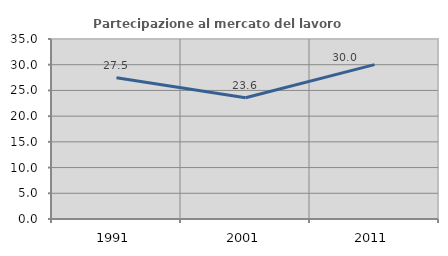
| Category | Partecipazione al mercato del lavoro  femminile |
|---|---|
| 1991.0 | 27.481 |
| 2001.0 | 23.576 |
| 2011.0 | 30.022 |